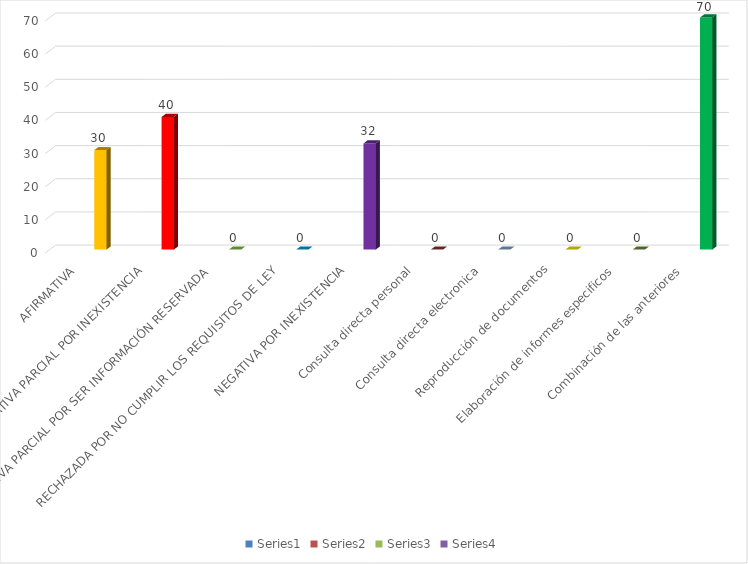
| Category | Series 0 | Series 1 | Series 2 | Series 3 |
|---|---|---|---|---|
| AFIRMATIVA |  |  |  | 30 |
| AFIRMATIVA PARCIAL POR INEXISTENCIA |  |  |  | 40 |
| AFIRMATIVA PARCIAL POR SER INFORMACIÓN RESERVADA |  |  |  | 0 |
| RECHAZADA POR NO CUMPLIR LOS REQUISITOS DE LEY |  |  |  | 0 |
| NEGATIVA POR INEXISTENCIA |  |  |  | 32 |
| Consulta directa personal |  |  |  | 0 |
| Consulta directa electronica |  |  |  | 0 |
| Reproducción de documentos |  |  |  | 0 |
| Elaboración de informes especificos |  |  |  | 0 |
| Combinación de las anteriores |  |  |  | 70 |